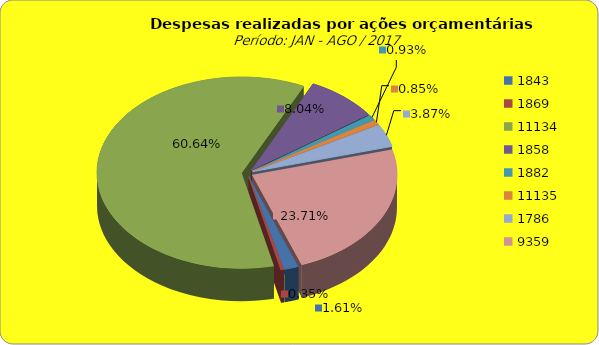
| Category | Series 1 |
|---|---|
| 1843.0 | 2831114.15 |
| 1869.0 | 618500.72 |
| 11134.0 | 106345143.75 |
| 1858.0 | 14098151.02 |
| 1882.0 | 1631451.32 |
| 11135.0 | 1483055.63 |
| 1786.0 | 6779933.44 |
| 9359.0 | 41578373.45 |